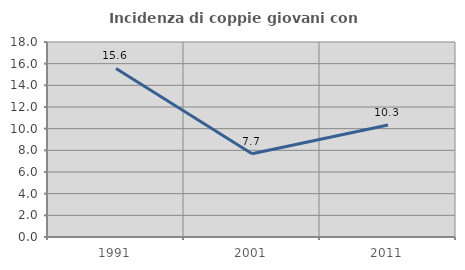
| Category | Incidenza di coppie giovani con figli |
|---|---|
| 1991.0 | 15.556 |
| 2001.0 | 7.692 |
| 2011.0 | 10.345 |